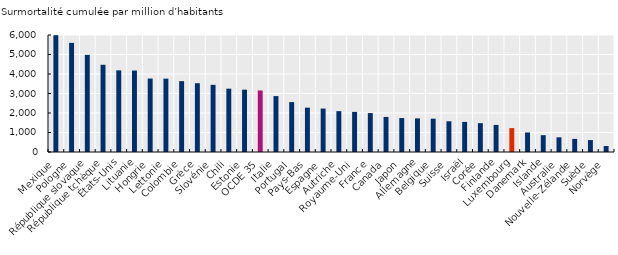
| Category | Surmortalité cumulée par million d’habitants
 |
|---|---|
| Mexique | 5988.744 |
| Pologne | 5596.125 |
| République slovaque | 4981.538 |
| République tchèque | 4473.029 |
| États-Unis | 4186.355 |
| Lituanie | 4176.637 |
| Hongrie | 3766.785 |
| Lettonie | 3761.123 |
| Colombie | 3634.792 |
| Grèce | 3527.151 |
| Slovénie | 3444.98 |
| Chili | 3247.8 |
| Estonie | 3197.725 |
| OCDE 35 | 3155.807 |
| Italie | 2866.372 |
| Portugal | 2559.123 |
| Pays-Bas | 2274.095 |
| Espagne | 2227.887 |
| Autriche | 2095.064 |
| Royaume-Uni | 2056.938 |
| France | 1995.949 |
| Canada | 1797.672 |
| Japon | 1739.995 |
| Allemagne | 1723.572 |
| Belgique | 1708.596 |
| Suisse | 1575.139 |
| Israël | 1543.716 |
| Corée | 1478.397 |
| Finlande | 1388.705 |
| Luxembourg | 1226.466 |
| Danemark | 1002.205 |
| Islande | 862.045 |
| Australie | 753.666 |
| Nouvelle-Zélande | 671.515 |
| Suède | 612.641 |
| Norvège | 306.041 |